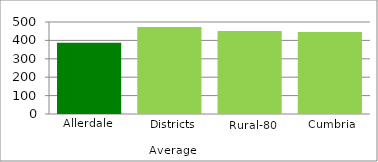
| Category | Series 1 |
|---|---|
| Allerdale | 387.7 |
| Districts Average | 473.212 |
| Rural-80 | 450.536 |
| Cumbria | 445.717 |